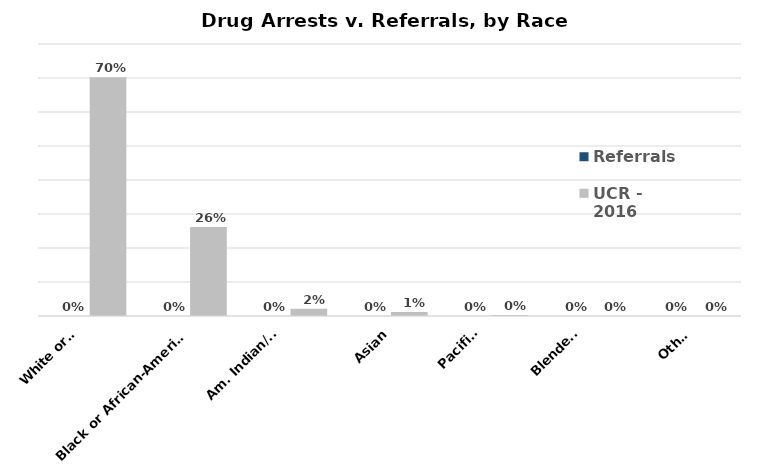
| Category | Referrals | UCR - 
2016 |
|---|---|---|
| White or
Caucasian | 0 | 0.702 |
| Black or African-American | 0 | 0.262 |
| Am. Indian/
Alaska Native | 0 | 0.021 |
| Asian | 0 | 0.012 |
| Pacific
Islander | 0 | 0.003 |
| Blended
Race | 0 | 0 |
| Other | 0 | 0 |